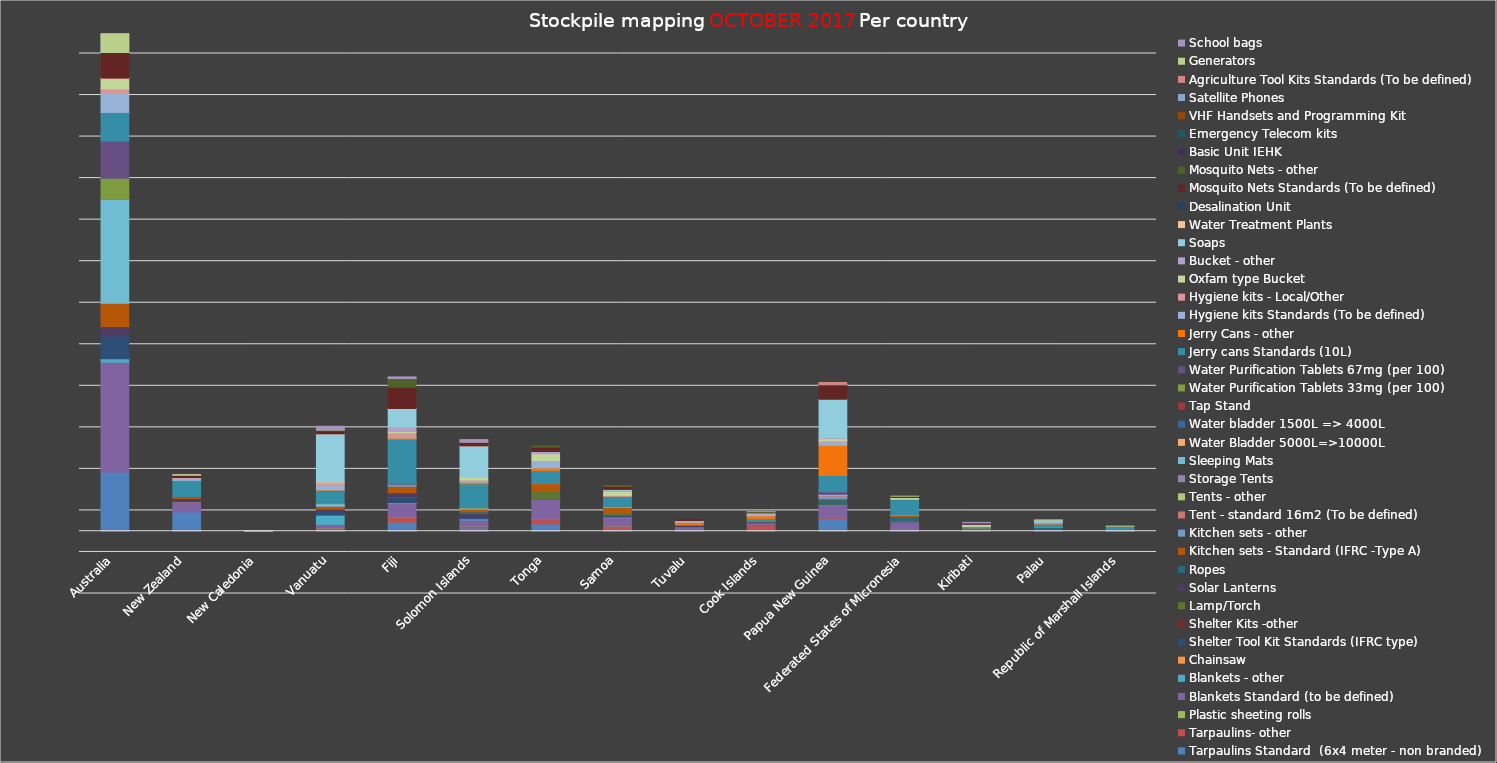
| Category | Tarpaulins Standard  (6x4 meter - non branded) | Tarpaulins- other | Plastic sheeting rolls | Blankets Standard (to be defined) | Blankets - other | Chainsaw | Shelter Tool Kit Standards (IFRC type) | Shelter Kits -other | Lamp/Torch | Solar Lanterns | Ropes | Kitchen sets - Standard (IFRC -Type A) | Kitchen sets - other | Tent - standard 16m2 (To be defined) | Tents - other | Storage Tents | Sleeping Mats | Water Bladder 5000L=>10000L | Water bladder 1500L => 4000L | Tap Stand | Water Purification Tablets 33mg (per 100) | Water Purification Tablets 67mg (per 100) | Jerry cans Standards (10L) | Jerry Cans - other | Hygiene kits Standards (To be defined) | Hygiene kits - Local/Other  | Oxfam type Bucket | Bucket - other | Soaps | Water Treatment Plants | Desalination Unit | Mosquito Nets Standards (To be defined) | Mosquito Nets - other | Basic Unit IEHK  | Emergency Telecom kits | VHF Handsets and Programming Kit | Satellite Phones | Agriculture Tool Kits Standards (To be defined) | Generators | School bags |
|---|---|---|---|---|---|---|---|---|---|---|---|---|---|---|---|---|---|---|---|---|---|---|---|---|---|---|---|---|---|---|---|---|---|---|---|---|---|---|---|---|
| Australia | 28419 | 0 | 0 | 52955 | 1650 | 0 | 10891 | 0 | 0 | 4579 | 0 | 11215 | 0 | 0 | 0 | 0 | 50023 | 9 | 17 | 8 | 10142 | 17930 | 13778 | 0 | 9417 | 1950 | 5157 | 0 | 0 | 2 | 0 | 21823 | 0 | 0 | 0 | 0 | 2 | 0 | 41 | 0 |
| New Zealand | 9234 | 0 | 0 | 4960 | 0 | 20 | 806 | 200 | 0 | 504 | 0 | 560 | 0 | 0 | 0 | 0 | 0 | 6 | 4 | 6 | 0 | 150 | 8000 | 0 | 1100 | 300 | 0 | 0 | 0 | 0 | 4 | 1100 | 0 | 0 | 0 | 14 | 5 | 200 | 20 | 0 |
| New Caledonia | 0 | 0 | 0 | 0 | 0 | 0 | 51 | 0 | 0 | 0 | 0 | 10 | 0 | 0 | 0 | 0 | 0 | 2 | 10 | 10 | 0 | 0 | 0 | 0 | 19 | 0 | 0 | 0 | 0 | 0 | 0 | 0 | 0 | 0 | 0 | 30 | 2 | 0 | 4 | 0 |
| Vanuatu | 663 | 860 | 6 | 1763 | 4421 | 3 | 2424 | 90 | 0 | 332 | 150 | 1273 | 293 | 0 | 20 | 5 | 994 | 6 | 12 | 12 | 90.04 | 0 | 6308 | 198 | 2026 | 1317 | 458 | 218 | 22947 | 2 | 0 | 1436 | 470 | 0 | 0 | 8 | 10 | 0 | 12 | 1702 |
| Fiji | 4349 | 2365 | 25 | 6568 | 413 | 0 | 2802 | 0 | 120 | 1823 | 120 | 3052 | 906 | 72 | 55 | 0 | 0 | 5 | 5 | 5 | 0 | 0.52 | 21612 | 600 | 207 | 2304 | 600 | 2214 | 8720 | 120 | 0 | 10272 | 4195 | 14 | 0 | 0 | 3 | 0 | 1 | 750 |
| Solomon Islands | 1588 | 812 | 1 | 2991 | 568 | 0 | 1192 | 0 | 0 | 1244 | 927 | 1109 | 711 | 0 | 87 | 0 | 0 | 0 | 10 | 0 | 198.8 | 0 | 11368 | 776 | 990 | 100 | 1273 | 0 | 15134 | 7 | 0 | 1580 | 73 | 200 | 0 | 0 | 6 | 90 | 0 | 1080 |
| Tonga | 3529 | 2142 | 6 | 9610 | 145 | 0 | 324 | 0 | 3384 | 0 | 1 | 3739 | 0 | 148 | 0 | 0 | 0 | 0 | 0 | 0 | 0 | 0 | 6133 | 1270 | 3621 | 0 | 3195 | 1112 | 0 | 0 | 0 | 2117 | 556 | 0 | 0 | 0 | 0 | 0 | 0 | 0 |
| Samoa | 1140 | 1345 | 4 | 4345 | 100 | 0 | 790 | 0 | 832 | 0 | 11 | 2890 | 8 | 0 | 305 | 0 | 0 | 2 | 2 | 0 | 6 | 0 | 4873 | 289 | 186 | 100 | 1971 | 520 | 392 | 0 | 0 | 1452 | 260 | 0 | 0 | 28 | 0 | 0 | 0 | 0 |
| Tuvalu | 703 | 185 | 0 | 1283 | 0 | 0 | 295 | 0 | 0 | 333 | 0 | 315 | 0 | 0 | 0 | 0 | 0 | 0 | 0 | 0 | 0 | 0 | 0 | 1185 | 366 | 0 | 395 | 0 | 0 | 0 | 0 | 592 | 0 | 0 | 0 | 0 | 0 | 0 | 0 | 0 |
| Cook Islands | 494 | 2688 | 0 | 628 | 134 | 0 | 313 | 0 | 119 | 216 | 37 | 418 | 0 | 0 | 1 | 0 | 0 | 0 | 0 | 0 | 0 | 0 | 1036 | 1341 | 345 | 0 | 14 | 1112 | 0 | 1 | 2 | 0 | 651 | 0 | 0 | 2 | 11 | 0 | 0 | 0 |
| Papua New Guinea | 6206 | 392 | 0 | 5855 | 232 | 0 | 200 | 68 | 79 | 0 | 2061 | 659 | 1035 | 335 | 0 | 1 | 614 | 0 | 0 | 0 | 0 | 1280 | 7776 | 14584 | 1608 | 551 | 1041 | 376 | 18558 | 1 | 0 | 6648 | 439 | 0 | 0 | 113 | 23 | 856 | 0 | 0 |
| Federated States of Micronesia | 1253 | 70 | 0 | 3142 | 0 | 0 | 98 | 0 | 629 | 50 | 1777 | 584 | 11 | 0 | 0 | 0 | 0 | 0 | 0 | 0 | 368 | 0 | 7366 | 0 | 196 | 0 | 692 | 0 | 0 | 0 | 5 | 608 | 0 | 0 | 0 | 0 | 0 | 0 | 3 | 0 |
| Kiribati | 293 | 0 | 0 | 560 | 229 | 0 | 0 | 0 | 0 | 94 | 176 | 199 | 0 | 0 | 0 | 0 | 0 | 0 | 0 | 0 | 4.99 | 0 | 600 | 0 | 216 | 0 | 730 | 0 | 206 | 0 | 0 | 698 | 0 | 2 | 0 | 0 | 0 | 0 | 0 | 229 |
| Palau | 300 | 75 | 0 | 500 | 0 | 0 | 50 | 0 | 0 | 100 | 810 | 100 | 0 | 0 | 1 | 0 | 0 | 0 | 0 | 0 | 25 | 0 | 1500 | 414 | 1000 | 0 | 100 | 0 | 304 | 0 | 0 | 0 | 0 | 0 | 1 | 0 | 6 | 0 | 34 | 0 |
| Republic of Marshall Islands | 85 | 0 | 0 | 0 | 0 | 0 | 0 | 0 | 0 | 0 | 15 | 0 | 0 | 0 | 0 | 0 | 0 | 0 | 0 | 0 | 256 | 0 | 1950 | 46 | 0 | 0 | 0 | 0 | 0 | 0 | 28 | 0 | 0 | 0 | 0 | 0 | 0 | 0 | 32 | 0 |